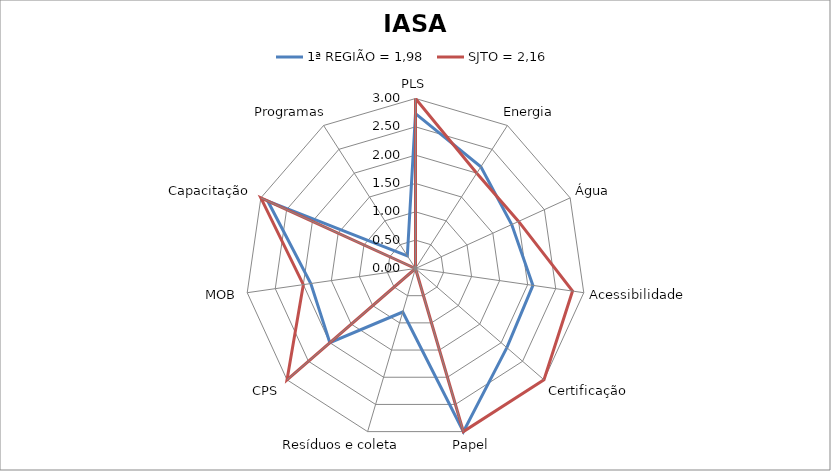
| Category | 1ª REGIÃO = 1,98 | SJTO = 2,16 |
|---|---|---|
| PLS | 2.733 | 3 |
| Energia | 2.133 | 2 |
| Água | 1.867 | 2 |
| Acessibilidade | 2.093 | 2.8 |
| Certificação | 2.133 | 3 |
| Papel | 3 | 3 |
| Resíduos e coleta | 0.8 | 0 |
| CPS | 2 | 3 |
| MOB | 1.867 | 2 |
| Capacitação | 2.867 | 3 |
| Programas | 0.267 | 0 |